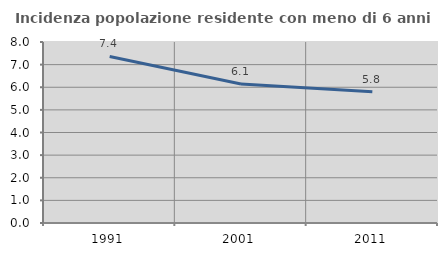
| Category | Incidenza popolazione residente con meno di 6 anni |
|---|---|
| 1991.0 | 7.362 |
| 2001.0 | 6.145 |
| 2011.0 | 5.801 |